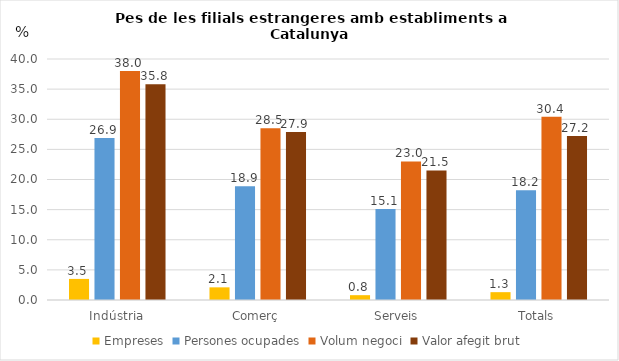
| Category | Empreses | Persones ocupades | Volum negoci | Valor afegit brut |
|---|---|---|---|---|
| Indústria | 3.5 | 26.9 | 38 | 35.8 |
| Comerç | 2.1 | 18.9 | 28.5 | 27.9 |
| Serveis | 0.8 | 15.1 | 23 | 21.5 |
| Totals | 1.3 | 18.2 | 30.4 | 27.2 |